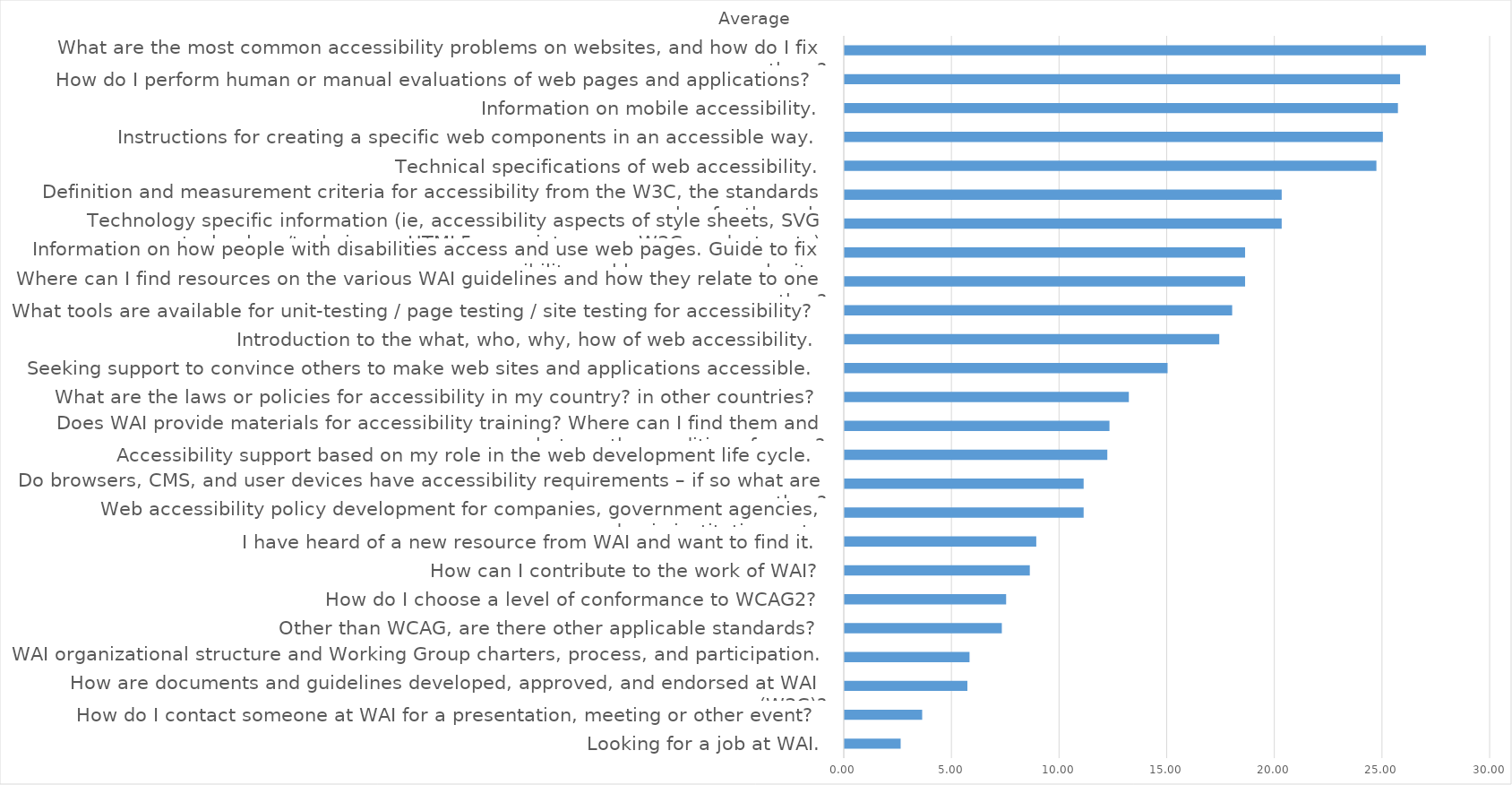
| Category | Average |
|---|---|
| Looking for a job at WAI. | 2.6 |
| How do I contact someone at WAI for a presentation, meeting or other event? | 3.6 |
| How are documents and guidelines developed, approved, and endorsed at WAI (W3C)? | 5.7 |
| WAI organizational structure and Working Group charters, process, and participation. | 5.8 |
| Other than WCAG, are there other applicable standards? | 7.3 |
| How do I choose a level of conformance to WCAG2? | 7.5 |
| How can I contribute to the work of WAI? | 8.6 |
| I have heard of a new resource from WAI and want to find it. | 8.9 |
| Web accessibility policy development for companies, government agencies, academic institutions, etc. | 11.1 |
| Do browsers, CMS, and user devices have accessibility requirements – if so what are they? | 11.1 |
| Accessibility support based on my role in the web development life cycle. | 12.2 |
| Does WAI provide materials for accessibility training? Where can I find them and what are the conditions for use? | 12.3 |
| What are the laws or policies for accessibility in my country? in other countries? | 13.2 |
| Seeking support to convince others to make web sites and applications accessible. | 15 |
| Introduction to the what, who, why, how of web accessibility. | 17.4 |
| What tools are available for unit-testing / page testing / site testing for accessibility? | 18 |
| Where can I find resources on the various WAI guidelines and how they relate to one another? | 18.6 |
| Information on how people with disabilities access and use web pages. Guide to fix accessibility problems on my web site. | 18.6 |
| Technology specific information (ie, accessibility aspects of style sheets, SVG technology/techniques, HTML5, proprietary non-W3C products, etc) | 20.3 |
| Definition and measurement criteria for accessibility from the W3C, the standards maker for the web. | 20.3 |
| Technical specifications of web accessibility. | 24.7 |
| Instructions for creating a specific web components in an accessible way. | 25 |
| Information on mobile accessibility. | 25.7 |
| How do I perform human or manual evaluations of web pages and applications? | 25.8 |
| What are the most common accessibility problems on websites, and how do I fix them? | 27 |